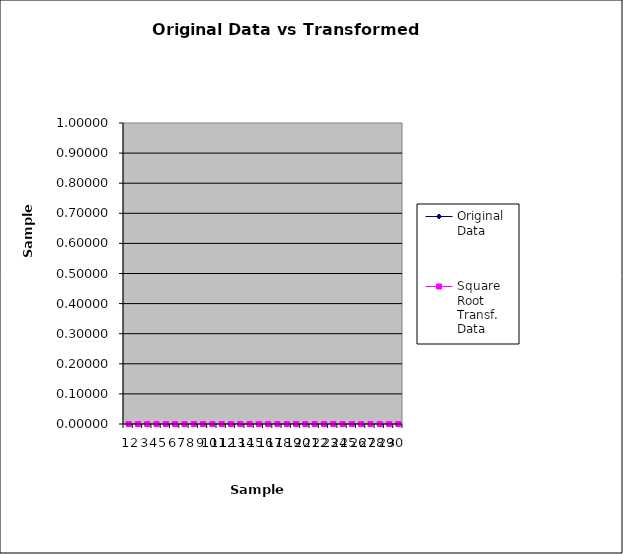
| Category | Original Data | Square Root Transf. Data |
|---|---|---|
| 0 |  | 0 |
| 1 |  | 0 |
| 2 |  | 0 |
| 3 |  | 0 |
| 4 |  | 0 |
| 5 |  | 0 |
| 6 |  | 0 |
| 7 |  | 0 |
| 8 |  | 0 |
| 9 |  | 0 |
| 10 |  | 0 |
| 11 |  | 0 |
| 12 |  | 0 |
| 13 |  | 0 |
| 14 |  | 0 |
| 15 |  | 0 |
| 16 |  | 0 |
| 17 |  | 0 |
| 18 |  | 0 |
| 19 |  | 0 |
| 20 |  | 0 |
| 21 |  | 0 |
| 22 |  | 0 |
| 23 |  | 0 |
| 24 |  | 0 |
| 25 |  | 0 |
| 26 |  | 0 |
| 27 |  | 0 |
| 28 |  | 0 |
| 29 |  | 0 |